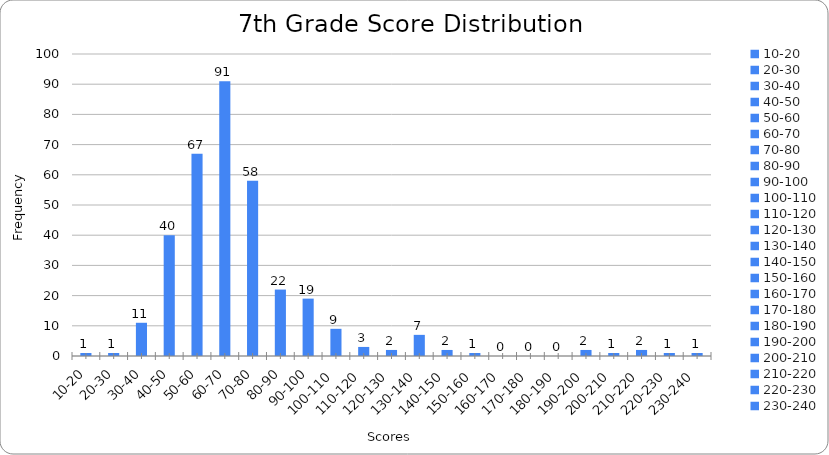
| Category | Series 0 |
|---|---|
| 10-20 | 1 |
| 20-30 | 1 |
| 30-40 | 11 |
| 40-50 | 40 |
| 50-60 | 67 |
| 60-70 | 91 |
| 70-80 | 58 |
| 80-90 | 22 |
| 90-100 | 19 |
| 100-110 | 9 |
| 110-120 | 3 |
| 120-130 | 2 |
| 130-140 | 7 |
| 140-150 | 2 |
| 150-160 | 1 |
| 160-170 | 0 |
| 170-180 | 0 |
| 180-190 | 0 |
| 190-200 | 2 |
| 200-210 | 1 |
| 210-220 | 2 |
| 220-230 | 1 |
| 230-240 | 1 |